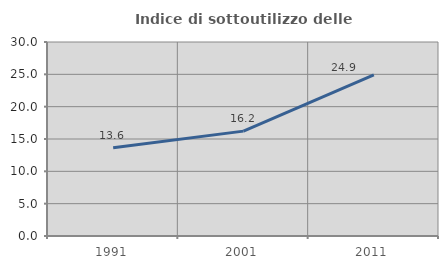
| Category | Indice di sottoutilizzo delle abitazioni  |
|---|---|
| 1991.0 | 13.646 |
| 2001.0 | 16.219 |
| 2011.0 | 24.898 |